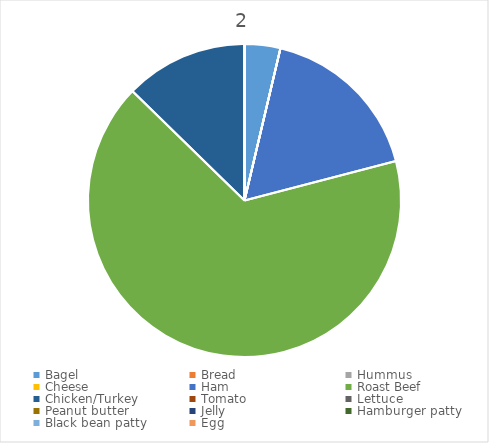
| Category | 2 |
|---|---|
| Bagel  | 41.16 |
| Bread | 0 |
| Hummus  | 0 |
| Cheese  | 0 |
| Ham  | 192.36 |
| Roast Beef  | 740.6 |
| Chicken/Turkey  | 141.68 |
| Tomato | 0 |
| Lettuce  | 0 |
| Peanut butter | 0 |
| Jelly  | 0 |
| Hamburger patty | 0 |
| Black bean patty | 0 |
| Egg | 0 |